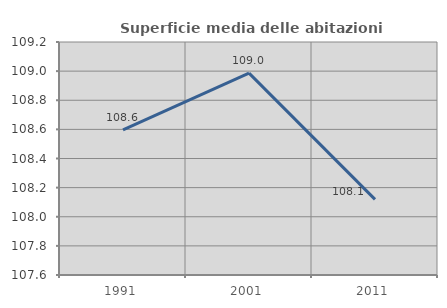
| Category | Superficie media delle abitazioni occupate |
|---|---|
| 1991.0 | 108.597 |
| 2001.0 | 108.986 |
| 2011.0 | 108.12 |